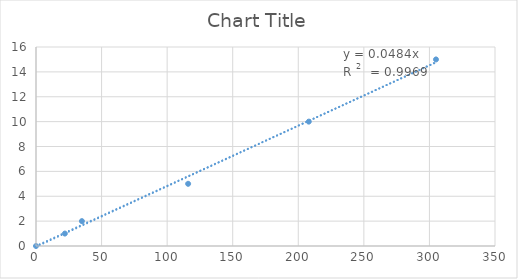
| Category | Series 0 |
|---|---|
| 0.0 | 0 |
| 22.0 | 1 |
| 35.0 | 2 |
| 116.0 | 5 |
| 208.0 | 10 |
| 305.0 | 15 |